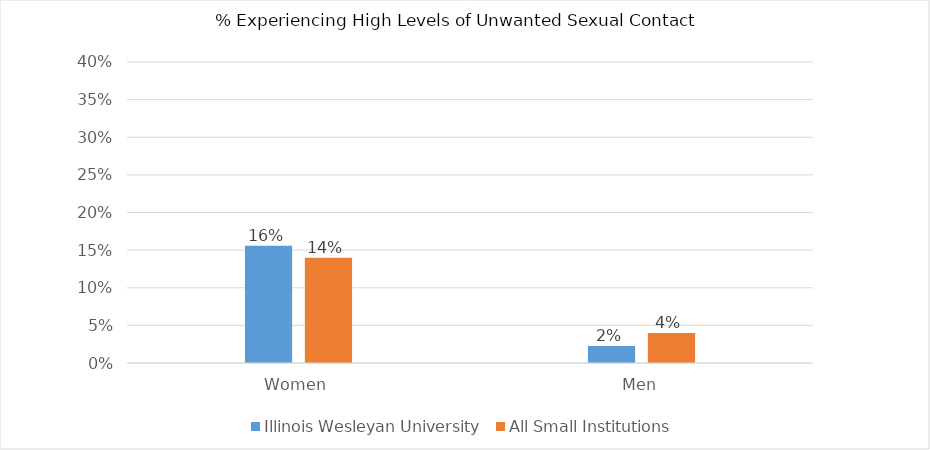
| Category | Illinois Wesleyan University | All Small Institutions |
|---|---|---|
| Women | 0.156 | 0.14 |
| Men | 0.023 | 0.04 |